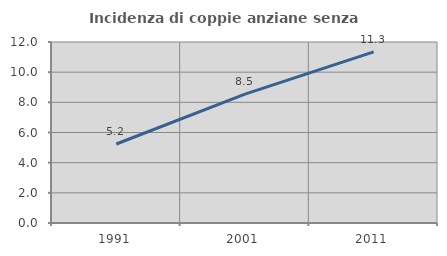
| Category | Incidenza di coppie anziane senza figli  |
|---|---|
| 1991.0 | 5.239 |
| 2001.0 | 8.54 |
| 2011.0 | 11.341 |